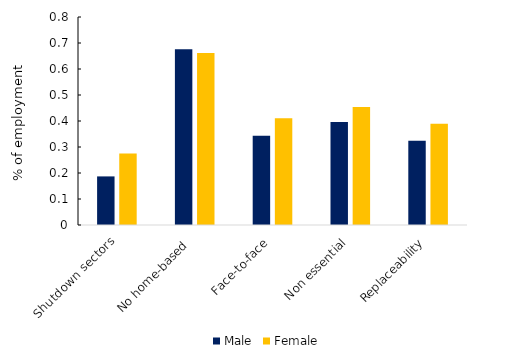
| Category | Male | Female |
|---|---|---|
| Shutdown sectors | 0.187 | 0.275 |
| No home-based  | 0.676 | 0.662 |
| Face-to-face | 0.344 | 0.411 |
| Non essential | 0.396 | 0.454 |
| Replaceability | 0.324 | 0.39 |